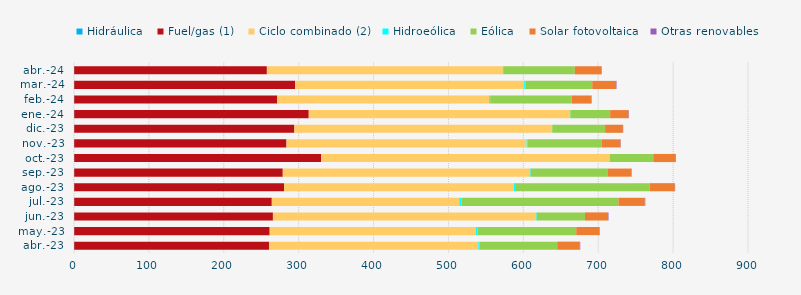
| Category | Hidráulica | Fuel/gas (1) | Ciclo combinado (2) | Hidroeólica | Eólica | Solar fotovoltaica | Otras renovables |
|---|---|---|---|---|---|---|---|
| abr.-23 | 0.276 | 260.1 | 279.544 | 1.573 | 103.784 | 30.083 | 0.631 |
| may.-23 | 0.298 | 261.008 | 275.341 | 2.067 | 131.928 | 30.799 | 0.651 |
| jun.-23 | 0.284 | 265.329 | 351.459 | 0.809 | 64.375 | 30.793 | 0.665 |
| jul.-23 | 0.302 | 263.817 | 250.521 | 2.759 | 209.602 | 35.179 | 0.646 |
| ago.-23 | 0.29 | 280.25 | 306.931 | 2.7 | 178.405 | 33.708 | 0.375 |
| sep.-23 | 0.289 | 278.469 | 329.651 | 1.315 | 103.256 | 31.407 | 0.372 |
| oct.-23 | 0.303 | 329.555 | 385.374 | 0.443 | 57.76 | 29.906 | 0.525 |
| nov.-23 | 0.28 | 283.46 | 320.608 | 1.09 | 99.231 | 25.098 | 0.425 |
| dic.-23 | 0.306 | 293.933 | 343.705 | 0.669 | 70.608 | 23.683 | 0.445 |
| ene.-24 | 0.296 | 313.174 | 348.608 | 0.668 | 53.195 | 24.559 | 0.5 |
| feb.-24 | 0.285 | 271.078 | 282.957 | 1.415 | 108.752 | 26.307 | 0.499 |
| mar.-24 | 0.273 | 294.882 | 305.967 | 1.589 | 89.282 | 31.906 | 0.578 |
| abr.-24 | 0.258 | 257.299 | 315.195 | 1.295 | 94.671 | 35.838 | 0.264 |